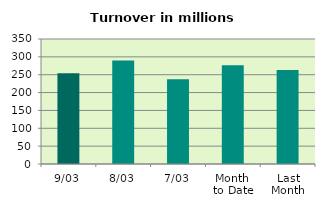
| Category | Series 0 |
|---|---|
| 9/03 | 253.871 |
| 8/03 | 289.826 |
| 7/03 | 237.1 |
| Month 
to Date | 276.821 |
| Last
Month | 263.32 |